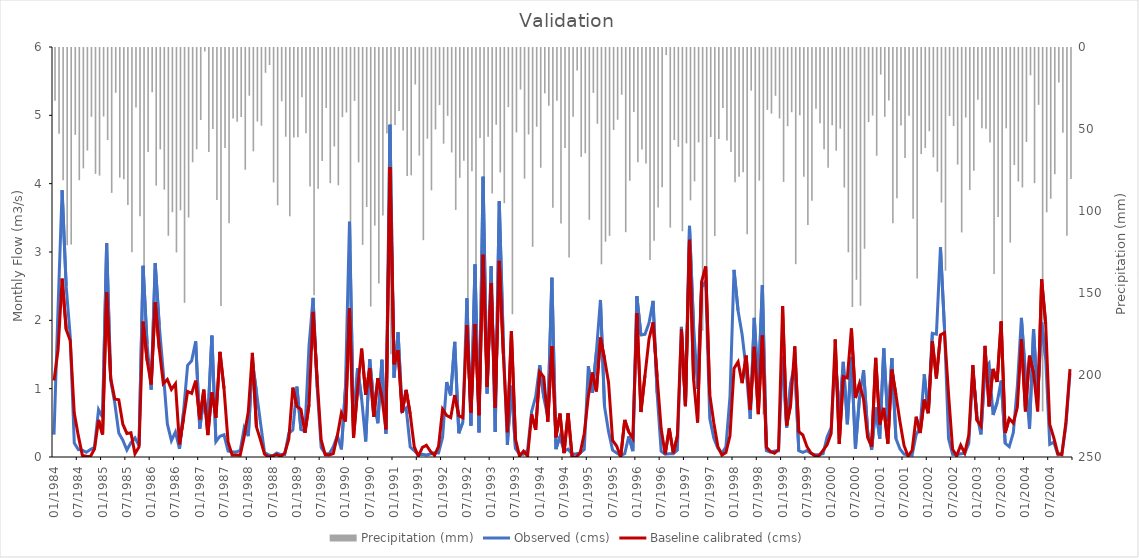
| Category | Precipitation (mm) |
|---|---|
| 1984-01-01 | 32.21 |
| 1984-02-01 | 52.22 |
| 1984-03-01 | 80.67 |
| 1984-04-01 | 120.33 |
| 1984-05-01 | 119.89 |
| 1984-06-01 | 52.97 |
| 1984-07-01 | 80.6 |
| 1984-08-01 | 73.4 |
| 1984-09-01 | 62.54 |
| 1984-10-01 | 41.94 |
| 1984-11-01 | 76.75 |
| 1984-12-01 | 77.81 |
| 1985-01-01 | 41.78 |
| 1985-02-01 | 56.1 |
| 1985-03-01 | 88.35 |
| 1985-04-01 | 27.3 |
| 1985-05-01 | 79.04 |
| 1985-06-01 | 80 |
| 1985-07-01 | 95.77 |
| 1985-08-01 | 124.54 |
| 1985-09-01 | 36.33 |
| 1985-10-01 | 102.55 |
| 1985-11-01 | 150.96 |
| 1985-12-01 | 63.4 |
| 1986-01-01 | 26.96 |
| 1986-02-01 | 83.92 |
| 1986-03-01 | 61.82 |
| 1986-04-01 | 86.38 |
| 1986-05-01 | 114.5 |
| 1986-06-01 | 100.14 |
| 1986-07-01 | 124.64 |
| 1986-08-01 | 98.96 |
| 1986-09-01 | 155.38 |
| 1986-10-01 | 103.36 |
| 1986-11-01 | 69.66 |
| 1986-12-01 | 61.75 |
| 1987-01-01 | 43.93 |
| 1987-02-01 | 2.13 |
| 1987-03-01 | 63.37 |
| 1987-04-01 | 49.32 |
| 1987-05-01 | 92.72 |
| 1987-06-01 | 157.31 |
| 1987-07-01 | 60.99 |
| 1987-08-01 | 106.85 |
| 1987-09-01 | 42.98 |
| 1987-10-01 | 45.02 |
| 1987-11-01 | 42.08 |
| 1987-12-01 | 74.24 |
| 1988-01-01 | 29.08 |
| 1988-02-01 | 62.99 |
| 1988-03-01 | 44.83 |
| 1988-04-01 | 47.4 |
| 1988-05-01 | 15.13 |
| 1988-06-01 | 10.4 |
| 1988-07-01 | 82.01 |
| 1988-08-01 | 95.89 |
| 1988-09-01 | 32.49 |
| 1988-10-01 | 54.1 |
| 1988-11-01 | 102.63 |
| 1988-12-01 | 54.56 |
| 1989-01-01 | 54.47 |
| 1989-02-01 | 30.07 |
| 1989-03-01 | 51.97 |
| 1989-04-01 | 84.39 |
| 1989-05-01 | 150.77 |
| 1989-06-01 | 85.75 |
| 1989-07-01 | 68.84 |
| 1989-08-01 | 36.59 |
| 1989-09-01 | 82.42 |
| 1989-10-01 | 60.06 |
| 1989-11-01 | 83.73 |
| 1989-12-01 | 42.15 |
| 1990-01-01 | 39.33 |
| 1990-02-01 | 121.57 |
| 1990-03-01 | 32.26 |
| 1990-04-01 | 69.73 |
| 1990-05-01 | 120.03 |
| 1990-06-01 | 96.95 |
| 1990-07-01 | 157.64 |
| 1990-08-01 | 108.29 |
| 1990-09-01 | 143.54 |
| 1990-10-01 | 102.15 |
| 1990-11-01 | 52.15 |
| 1990-12-01 | 186.76 |
| 1991-01-01 | 46.99 |
| 1991-02-01 | 38.49 |
| 1991-03-01 | 50.23 |
| 1991-04-01 | 78 |
| 1991-05-01 | 77.62 |
| 1991-06-01 | 22.26 |
| 1991-07-01 | 65.64 |
| 1991-08-01 | 117.18 |
| 1991-09-01 | 55.33 |
| 1991-10-01 | 86.78 |
| 1991-11-01 | 49.68 |
| 1991-12-01 | 34.82 |
| 1992-01-01 | 58.35 |
| 1992-02-01 | 41.37 |
| 1992-03-01 | 63.72 |
| 1992-04-01 | 98.74 |
| 1992-05-01 | 79.14 |
| 1992-06-01 | 68.72 |
| 1992-07-01 | 197.87 |
| 1992-08-01 | 75.21 |
| 1992-09-01 | 176.29 |
| 1992-10-01 | 54.86 |
| 1992-11-01 | 141.46 |
| 1992-12-01 | 54.12 |
| 1993-01-01 | 88.73 |
| 1993-02-01 | 46.81 |
| 1993-03-01 | 75.91 |
| 1993-04-01 | 94.63 |
| 1993-05-01 | 36.04 |
| 1993-06-01 | 162.36 |
| 1993-07-01 | 51.47 |
| 1993-08-01 | 25.32 |
| 1993-09-01 | 79.67 |
| 1993-10-01 | 52.73 |
| 1993-11-01 | 121.26 |
| 1993-12-01 | 48.02 |
| 1994-01-01 | 73 |
| 1994-02-01 | 27.67 |
| 1994-03-01 | 35.24 |
| 1994-04-01 | 97.43 |
| 1994-05-01 | 32.13 |
| 1994-06-01 | 106.98 |
| 1994-07-01 | 60.9 |
| 1994-08-01 | 127.74 |
| 1994-09-01 | 41.91 |
| 1994-10-01 | 13.68 |
| 1994-11-01 | 66.39 |
| 1994-12-01 | 64.18 |
| 1995-01-01 | 104.77 |
| 1995-02-01 | 27.35 |
| 1995-03-01 | 46.2 |
| 1995-04-01 | 131.91 |
| 1995-05-01 | 118.14 |
| 1995-06-01 | 114.56 |
| 1995-07-01 | 49.98 |
| 1995-08-01 | 43.76 |
| 1995-09-01 | 28.48 |
| 1995-10-01 | 112.31 |
| 1995-11-01 | 80.96 |
| 1995-12-01 | 39.01 |
| 1996-01-01 | 69.68 |
| 1996-02-01 | 61.82 |
| 1996-03-01 | 70.49 |
| 1996-04-01 | 129.26 |
| 1996-05-01 | 117.51 |
| 1996-06-01 | 97.26 |
| 1996-07-01 | 84.92 |
| 1996-08-01 | 4.33 |
| 1996-09-01 | 109.52 |
| 1996-10-01 | 56.08 |
| 1996-11-01 | 60.31 |
| 1996-12-01 | 111.76 |
| 1997-01-01 | 58.17 |
| 1997-02-01 | 92.92 |
| 1997-03-01 | 81.31 |
| 1997-04-01 | 57.58 |
| 1997-05-01 | 172.44 |
| 1997-06-01 | 183.74 |
| 1997-07-01 | 54.25 |
| 1997-08-01 | 114.7 |
| 1997-09-01 | 55.54 |
| 1997-10-01 | 36.58 |
| 1997-11-01 | 56.33 |
| 1997-12-01 | 63.48 |
| 1998-01-01 | 81.82 |
| 1998-02-01 | 78.49 |
| 1998-03-01 | 75.77 |
| 1998-04-01 | 113.5 |
| 1998-05-01 | 26.01 |
| 1998-06-01 | 182.04 |
| 1998-07-01 | 80.89 |
| 1998-08-01 | 223.5 |
| 1998-09-01 | 37.74 |
| 1998-10-01 | 40.02 |
| 1998-11-01 | 29.15 |
| 1998-12-01 | 43 |
| 1999-01-01 | 81.65 |
| 1999-02-01 | 47.69 |
| 1999-03-01 | 39.16 |
| 1999-04-01 | 131.82 |
| 1999-05-01 | 41.08 |
| 1999-06-01 | 78.55 |
| 1999-07-01 | 107.89 |
| 1999-08-01 | 93.21 |
| 1999-09-01 | 37.07 |
| 1999-10-01 | 45.82 |
| 1999-11-01 | 61.69 |
| 1999-12-01 | 72.98 |
| 2000-01-01 | 47.12 |
| 2000-02-01 | 62.62 |
| 2000-03-01 | 49.2 |
| 2000-04-01 | 85.07 |
| 2000-05-01 | 124.56 |
| 2000-06-01 | 157.96 |
| 2000-07-01 | 141.35 |
| 2000-08-01 | 157.17 |
| 2000-09-01 | 122.43 |
| 2000-10-01 | 45.16 |
| 2000-11-01 | 41.17 |
| 2000-12-01 | 65.68 |
| 2001-01-01 | 16.19 |
| 2001-02-01 | 41.97 |
| 2001-03-01 | 31.99 |
| 2001-04-01 | 106.79 |
| 2001-05-01 | 91.68 |
| 2001-06-01 | 47.3 |
| 2001-07-01 | 67 |
| 2001-08-01 | 41.31 |
| 2001-09-01 | 104.14 |
| 2001-10-01 | 140.54 |
| 2001-11-01 | 64.72 |
| 2001-12-01 | 61.03 |
| 2002-01-01 | 50.76 |
| 2002-02-01 | 66.64 |
| 2002-03-01 | 75.47 |
| 2002-04-01 | 94.22 |
| 2002-05-01 | 135.76 |
| 2002-06-01 | 41.51 |
| 2002-07-01 | 47.62 |
| 2002-08-01 | 71.06 |
| 2002-09-01 | 112.47 |
| 2002-10-01 | 42.38 |
| 2002-11-01 | 86.56 |
| 2002-12-01 | 74.9 |
| 2003-01-01 | 31.52 |
| 2003-02-01 | 48.93 |
| 2003-03-01 | 49.26 |
| 2003-04-01 | 57.59 |
| 2003-05-01 | 137.84 |
| 2003-06-01 | 103.04 |
| 2003-07-01 | 174.57 |
| 2003-08-01 | 48.97 |
| 2003-09-01 | 118.67 |
| 2003-10-01 | 71.37 |
| 2003-11-01 | 81.39 |
| 2003-12-01 | 85.04 |
| 2004-01-01 | 57.3 |
| 2004-02-01 | 16.65 |
| 2004-03-01 | 82.42 |
| 2004-04-01 | 34.66 |
| 2004-05-01 | 221.64 |
| 2004-06-01 | 100.19 |
| 2004-07-01 | 91.94 |
| 2004-08-01 | 76.96 |
| 2004-09-01 | 21.01 |
| 2004-10-01 | 51.7 |
| 2004-11-01 | 114.49 |
| 2004-12-01 | 79.94 |